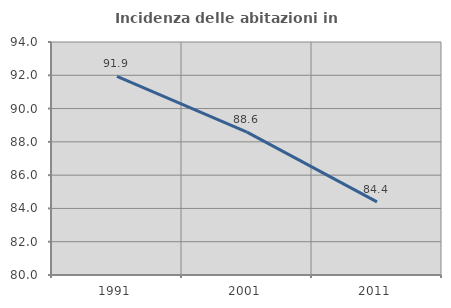
| Category | Incidenza delle abitazioni in proprietà  |
|---|---|
| 1991.0 | 91.93 |
| 2001.0 | 88.583 |
| 2011.0 | 84.393 |